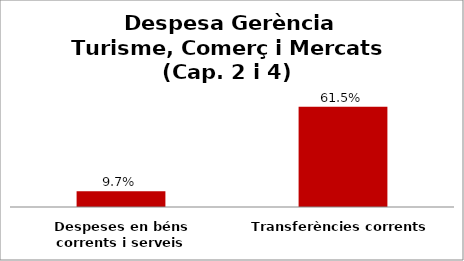
| Category | Series 0 |
|---|---|
| Despeses en béns corrents i serveis | 0.097 |
| Transferències corrents | 0.615 |